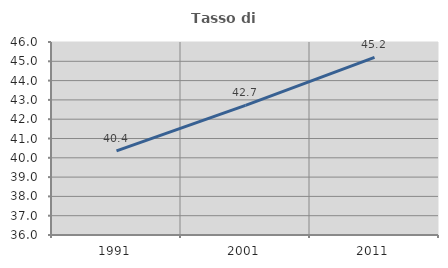
| Category | Tasso di occupazione   |
|---|---|
| 1991.0 | 40.356 |
| 2001.0 | 42.712 |
| 2011.0 | 45.205 |